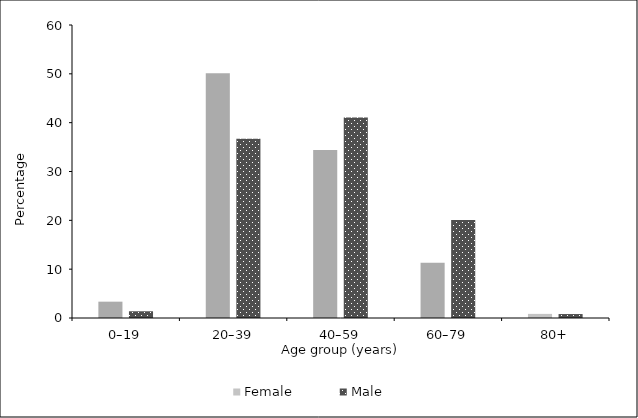
| Category | Female | Male |
|---|---|---|
| 0–19 | 3.343 | 1.379 |
| 20–39 | 50.105 | 36.691 |
| 40–59 | 34.405 | 41.044 |
| 60–79 | 11.305 | 20.076 |
| 80+ | 0.842 | 0.81 |